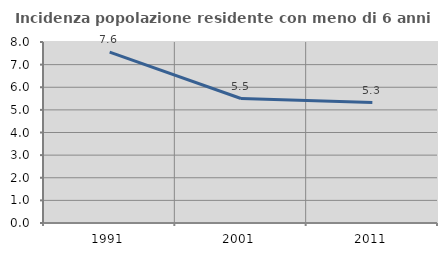
| Category | Incidenza popolazione residente con meno di 6 anni |
|---|---|
| 1991.0 | 7.556 |
| 2001.0 | 5.502 |
| 2011.0 | 5.321 |